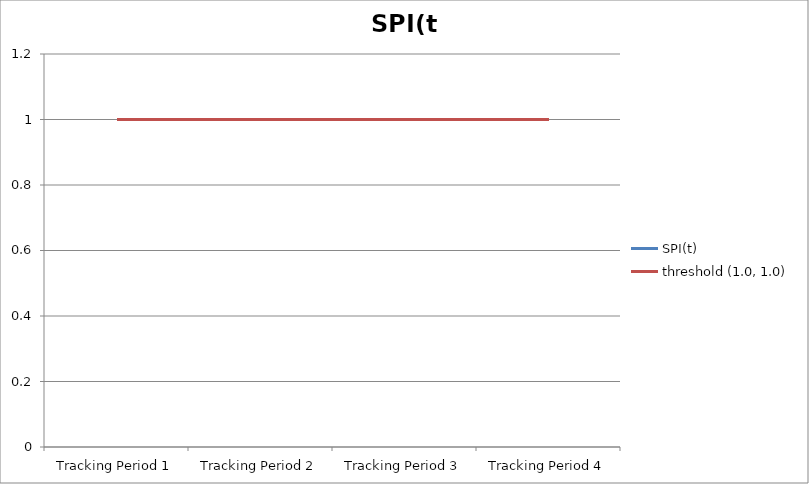
| Category | SPI(t) | threshold (1.0, 1.0) |
|---|---|---|
| Tracking Period 1 | 1 | 1 |
| Tracking Period 2 | 1 | 1 |
| Tracking Period 3 | 1 | 1 |
| Tracking Period 4 | 1 | 1 |